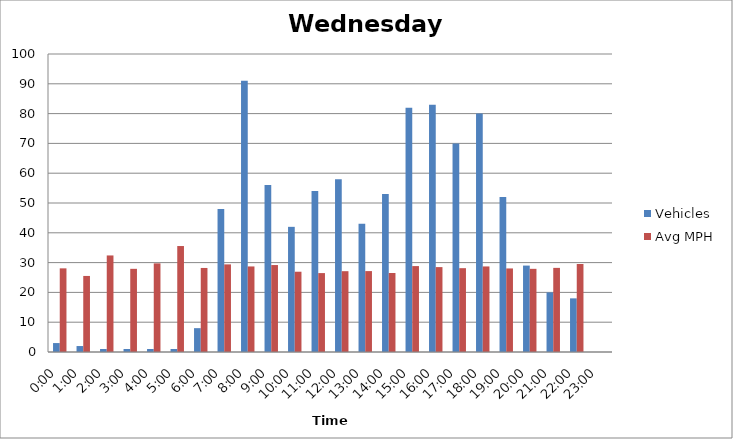
| Category | Vehicles | Avg MPH |
|---|---|---|
| 0:00 | 3 | 28.07 |
| 1:00 | 2 | 25.52 |
| 2:00 | 1 | 32.4 |
| 3:00 | 1 | 27.91 |
| 4:00 | 1 | 29.74 |
| 5:00 | 1 | 35.56 |
| 6:00 | 8 | 28.2 |
| 7:00 | 48 | 29.4 |
| 8:00 | 91 | 28.71 |
| 9:00 | 56 | 29.18 |
| 10:00 | 42 | 26.94 |
| 11:00 | 54 | 26.48 |
| 12:00 | 58 | 27.12 |
| 13:00 | 43 | 27.15 |
| 14:00 | 53 | 26.51 |
| 15:00 | 82 | 28.83 |
| 16:00 | 83 | 28.49 |
| 17:00 | 70 | 28.13 |
| 18:00 | 80 | 28.71 |
| 19:00 | 52 | 28.04 |
| 20:00 | 29 | 27.91 |
| 21:00 | 20 | 28.23 |
| 22:00 | 18 | 29.54 |
| 23:00 | 0 | 0 |